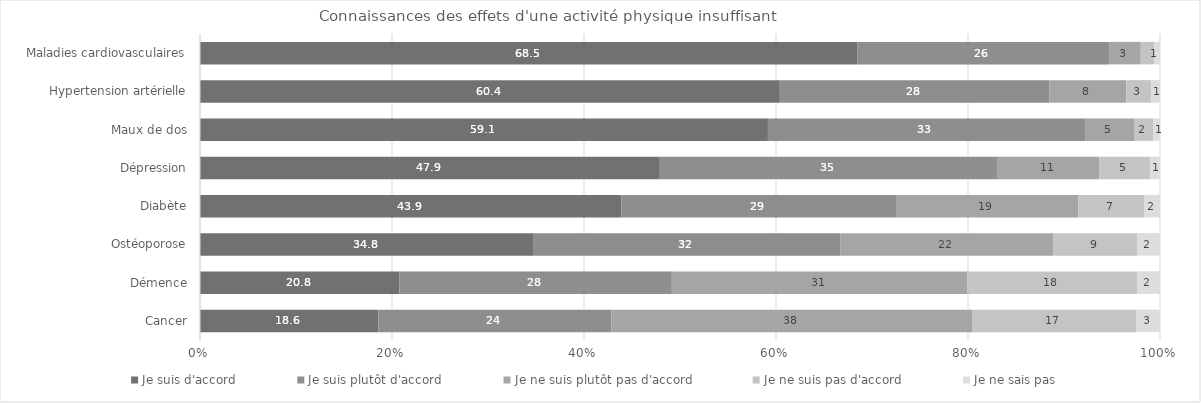
| Category | Je suis d'accord | Je suis plutôt d'accord | Je ne suis plutôt pas d'accord | Je ne suis pas d'accord | Je ne sais pas |
|---|---|---|---|---|---|
| Maladies cardiovasculaires | 68.5 | 26.2 | 3.3 | 1.4 | 0.6 |
| Hypertension artérielle | 60.4 | 28.1 | 8 | 2.6 | 0.9 |
| Maux de dos | 59.1 | 33 | 5.1 | 2 | 0.7 |
| Dépression | 47.9 | 35.2 | 10.6 | 5.3 | 1 |
| Diabète | 43.9 | 28.6 | 19 | 6.9 | 1.6 |
| Ostéoporose | 34.8 | 32 | 22.2 | 8.7 | 2.4 |
| Démence | 20.8 | 28.4 | 30.8 | 17.7 | 2.4 |
| Cancer | 18.6 | 24.3 | 37.6 | 17.1 | 2.5 |